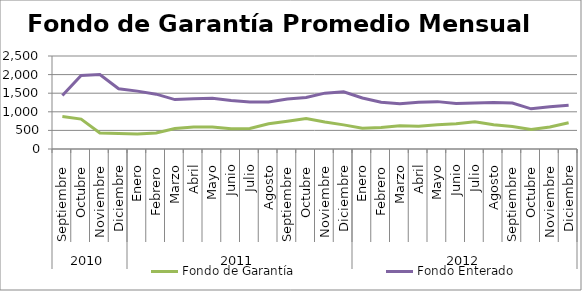
| Category | Fondo de Garantía | Fondo Enterado |
|---|---|---|
| 0 | 871.43 | 1439.553 |
| 1 | 804.208 | 1973.732 |
| 2 | 428.758 | 2004.096 |
| 3 | 417.974 | 1620.905 |
| 4 | 403.651 | 1555.632 |
| 5 | 429.02 | 1474.054 |
| 6 | 551.344 | 1328.521 |
| 7 | 591.732 | 1351.463 |
| 8 | 591.784 | 1363.301 |
| 9 | 544.875 | 1304.985 |
| 10 | 551.606 | 1265.502 |
| 11 | 679.839 | 1266.018 |
| 12 | 747.74 | 1344.929 |
| 13 | 819.75 | 1383.171 |
| 14 | 723.635 | 1501.378 |
| 15 | 648.288 | 1537.485 |
| 16 | 560.173 | 1370.992 |
| 17 | 575.916 | 1258.831 |
| 18 | 622.075 | 1216.471 |
| 19 | 612.299 | 1258.963 |
| 20 | 654.277 | 1273.362 |
| 21 | 675.965 | 1225.977 |
| 22 | 729.97 | 1235.91 |
| 23 | 649.095 | 1253.333 |
| 24 | 606.03 | 1237.548 |
| 25 | 525.314 | 1079.857 |
| 26 | 591.646 | 1134.772 |
| 27 | 703.403 | 1179.191 |